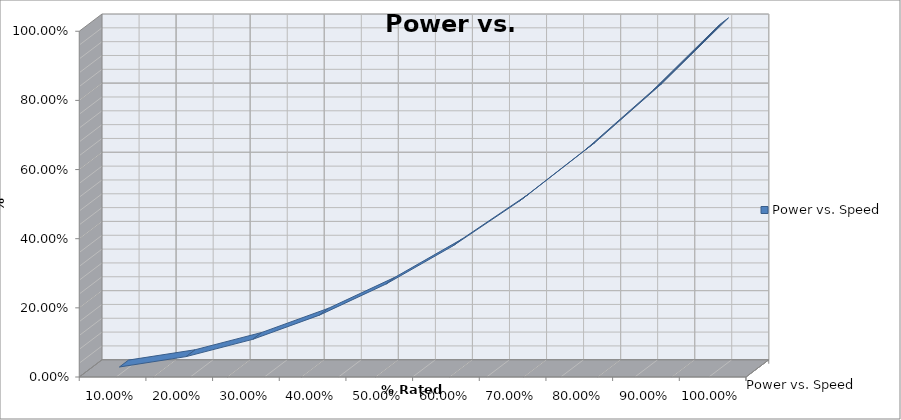
| Category | Power vs. Speed |
|---|---|
| 0.1 | 0.01 |
| 0.2 | 0.04 |
| 0.3 | 0.09 |
| 0.4 | 0.16 |
| 0.5 | 0.25 |
| 0.6 | 0.36 |
| 0.7 | 0.49 |
| 0.8 | 0.64 |
| 0.9 | 0.81 |
| 1.0 | 1 |